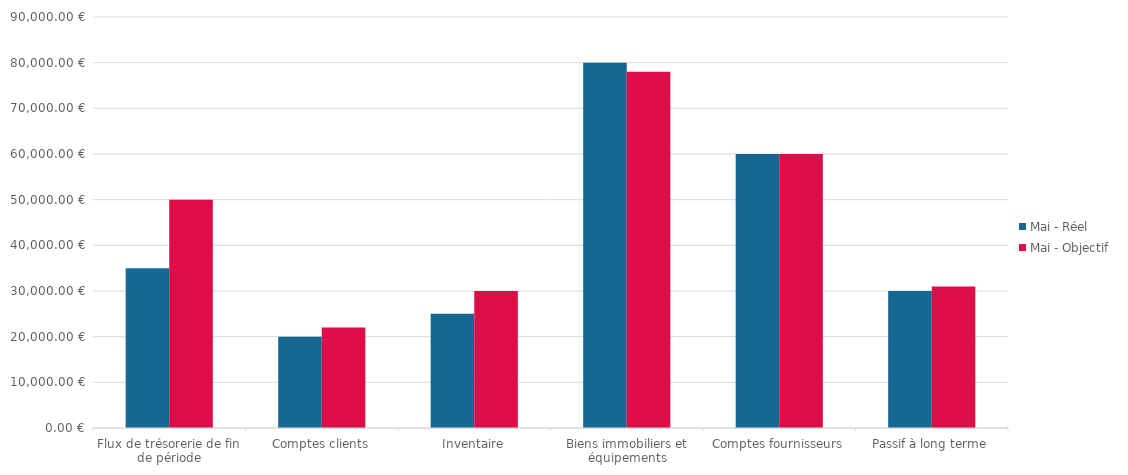
| Category | Mai - Réel | Mai - Objectif |
|---|---|---|
| Flux de trésorerie de fin de période | 35000 | 50000 |
| Comptes clients | 20000 | 22000 |
| Inventaire | 25000 | 30000 |
| Biens immobiliers et équipements | 80000 | 78000 |
| Comptes fournisseurs | 60000 | 60000 |
| Passif à long terme | 30000 | 31000 |